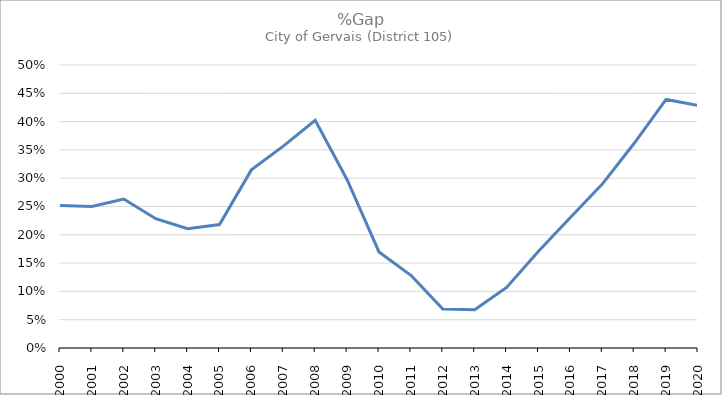
| Category | Series 0 |
|---|---|
| 2000.0 | 0.252 |
| 2001.0 | 0.25 |
| 2002.0 | 0.263 |
| 2003.0 | 0.228 |
| 2004.0 | 0.211 |
| 2005.0 | 0.218 |
| 2006.0 | 0.315 |
| 2007.0 | 0.357 |
| 2008.0 | 0.402 |
| 2009.0 | 0.297 |
| 2010.0 | 0.17 |
| 2011.0 | 0.128 |
| 2012.0 | 0.069 |
| 2013.0 | 0.067 |
| 2014.0 | 0.107 |
| 2015.0 | 0.171 |
| 2016.0 | 0.231 |
| 2017.0 | 0.29 |
| 2018.0 | 0.362 |
| 2019.0 | 0.439 |
| 2020.0 | 0.428 |